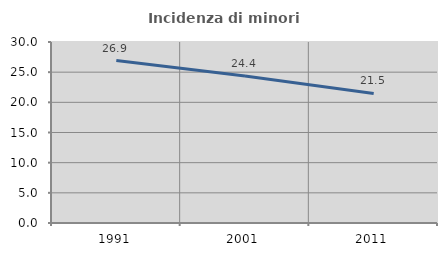
| Category | Incidenza di minori stranieri |
|---|---|
| 1991.0 | 26.923 |
| 2001.0 | 24.37 |
| 2011.0 | 21.473 |